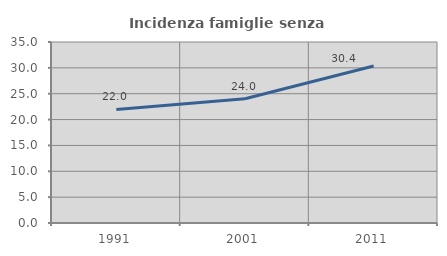
| Category | Incidenza famiglie senza nuclei |
|---|---|
| 1991.0 | 21.956 |
| 2001.0 | 24.018 |
| 2011.0 | 30.36 |